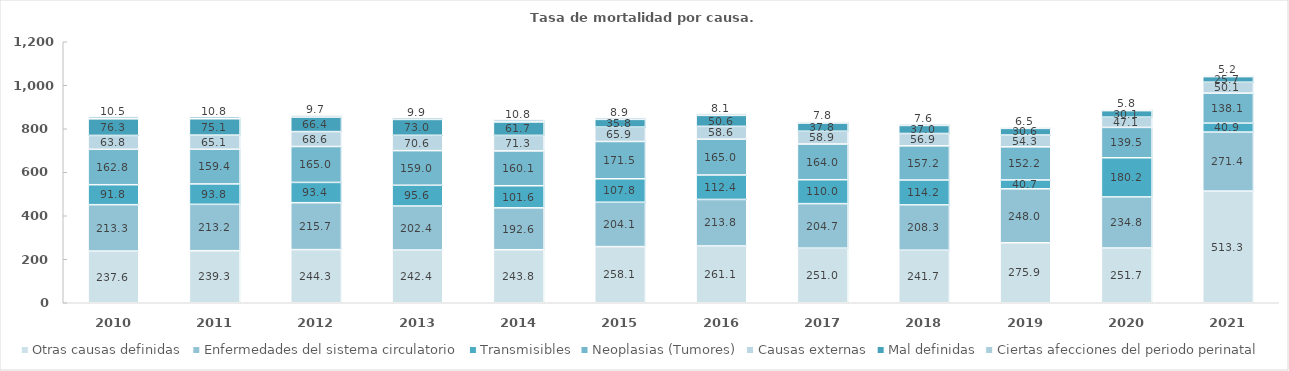
| Category | Otras causas definidas | Enfermedades del sistema circulatorio | Transmisibles | Neoplasias (Tumores) | Causas externas | Mal definidas | Ciertas afecciones del periodo perinatal |
|---|---|---|---|---|---|---|---|
| 2010.0 | 237.648 | 213.32 | 91.84 | 162.751 | 63.762 | 76.316 | 10.458 |
| 2011.0 | 239.31 | 213.18 | 93.795 | 159.403 | 65.119 | 75.124 | 10.789 |
| 2012.0 | 244.333 | 215.655 | 93.387 | 165.005 | 68.621 | 66.411 | 9.729 |
| 2013.0 | 242.363 | 202.4 | 95.585 | 159.049 | 70.553 | 72.962 | 9.9 |
| 2014.0 | 243.811 | 192.601 | 101.639 | 160.139 | 71.334 | 61.725 | 10.825 |
| 2015.0 | 258.064 | 204.07 | 107.839 | 171.528 | 65.919 | 35.767 | 8.874 |
| 2016.0 | 261.091 | 213.847 | 112.438 | 164.966 | 58.637 | 50.577 | 8.084 |
| 2017.0 | 250.997 | 204.749 | 109.986 | 164.039 | 58.871 | 37.773 | 7.828 |
| 2018.0 | 241.656 | 208.341 | 114.174 | 157.166 | 56.868 | 37.026 | 7.614 |
| 2019.0 | 275.891 | 248.005 | 40.691 | 152.235 | 54.34 | 30.574 | 6.467 |
| 2020.0 | 251.698 | 234.817 | 180.179 | 139.517 | 47.063 | 30.055 | 5.809 |
| 2021.0 | 513.344 | 271.448 | 40.928 | 138.128 | 50.107 | 25.721 | 5.188 |